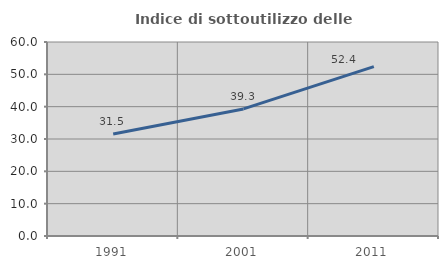
| Category | Indice di sottoutilizzo delle abitazioni  |
|---|---|
| 1991.0 | 31.517 |
| 2001.0 | 39.3 |
| 2011.0 | 52.386 |